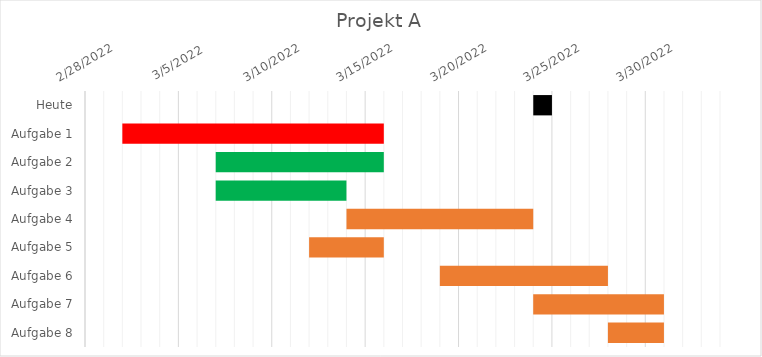
| Category | Start | Tage |
|---|---|---|
| Heute | 3/24/22 | 1 |
| Aufgabe 1 | 3/2/22 | 14 |
| Aufgabe 2 | 3/7/22 | 9 |
| Aufgabe 3 | 3/7/22 | 7 |
| Aufgabe 4 | 3/14/22 | 10 |
| Aufgabe 5 | 3/12/22 | 4 |
| Aufgabe 6 | 3/19/22 | 9 |
| Aufgabe 7 | 3/24/22 | 7 |
| Aufgabe 8 | 3/28/22 | 3 |